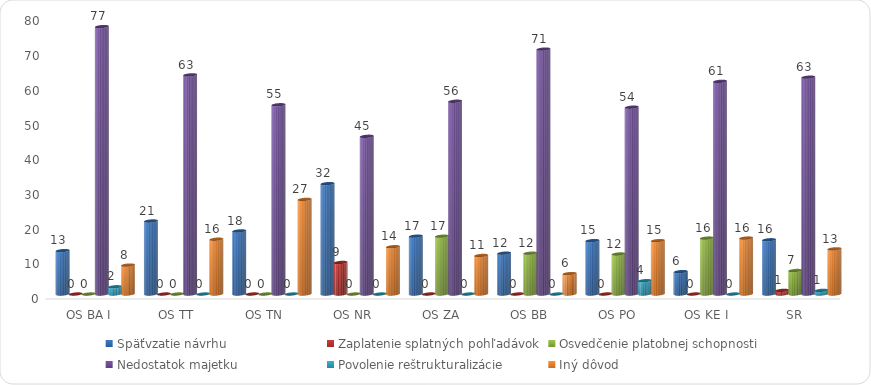
| Category | Späťvzatie návrhu | Zaplatenie splatných pohľadávok | Osvedčenie platobnej schopnosti | Nedostatok majetku | Povolenie reštrukturalizácie | Iný dôvod |
|---|---|---|---|---|---|---|
| OS BA I | 12.5 | 0 | 0 | 77.083 | 2.083 | 8.333 |
| OS TT | 21.053 | 0 | 0 | 63.158 | 0 | 15.789 |
| OS TN | 18.182 | 0 | 0 | 54.545 | 0 | 27.273 |
| OS NR | 31.818 | 9.091 | 0 | 45.455 | 0 | 13.636 |
| OS ZA | 16.667 | 0 | 16.667 | 55.556 | 0 | 11.111 |
| OS BB | 11.765 | 0 | 11.765 | 70.588 | 0 | 5.882 |
| OS PO | 15.385 | 0 | 11.538 | 53.846 | 3.846 | 15.385 |
| OS KE I | 6.452 | 0 | 16.129 | 61.29 | 0 | 16.129 |
| SR | 15.625 | 1.042 | 6.771 | 62.5 | 1.042 | 13.021 |